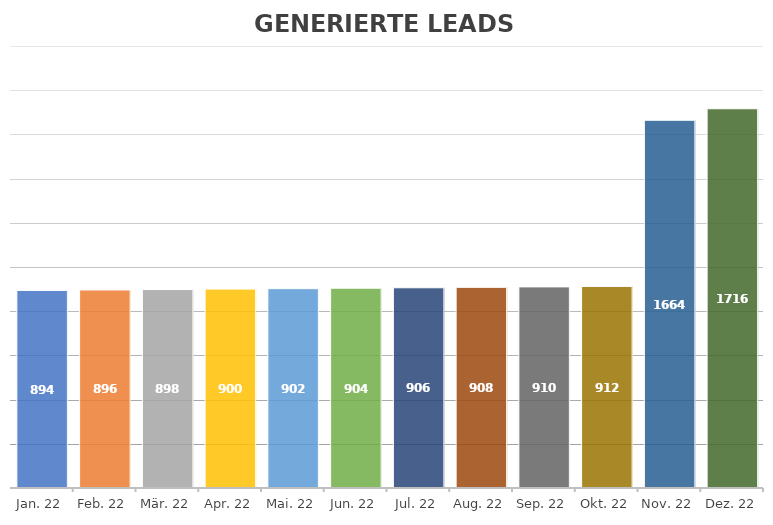
| Category | GESAMT |
|---|---|
| 2022-01-18 | 894 |
| 2022-02-18 | 896 |
| 2022-03-18 | 898 |
| 2022-04-18 | 900 |
| 2022-05-18 | 902 |
| 2022-06-18 | 904 |
| 2022-07-18 | 906 |
| 2022-08-18 | 908 |
| 2022-09-18 | 910 |
| 2022-10-18 | 912 |
| 2022-11-18 | 1664 |
| 2022-12-18 | 1716 |